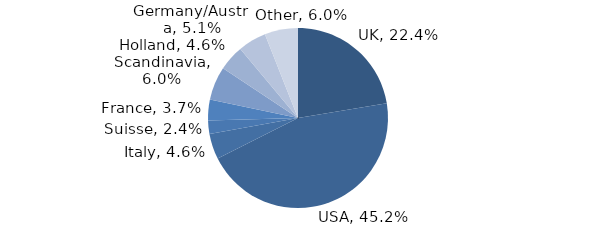
| Category | Investment Style |
|---|---|
| UK | 0.224 |
| USA | 0.452 |
| Italy | 0.046 |
| Suisse | 0.024 |
| France | 0.037 |
| Scandinavia | 0.06 |
| Holland | 0.046 |
| Germany/Austria | 0.051 |
| Other | 0.06 |